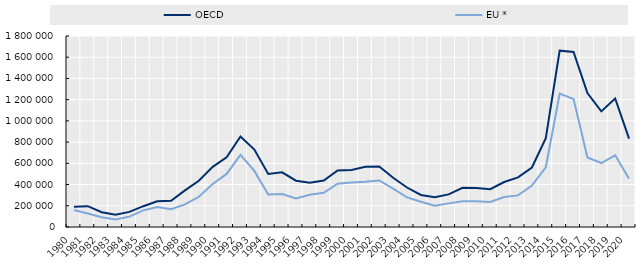
| Category | OECD | EU * |
|---|---|---|
| 1980.0 | 190529 | 159997 |
| 1981.0 | 196358 | 127564 |
| 1982.0 | 138679 | 91932 |
| 1983.0 | 115012 | 70282 |
| 1984.0 | 142302 | 97373 |
| 1985.0 | 196152 | 156711 |
| 1986.0 | 243156 | 188030 |
| 1987.0 | 246813 | 168459 |
| 1988.0 | 344604 | 213427 |
| 1989.0 | 435813 | 284890 |
| 1990.0 | 566814 | 405281 |
| 1991.0 | 657562 | 500255 |
| 1992.0 | 853314 | 679738 |
| 1993.0 | 730345 | 528805 |
| 1994.0 | 500175 | 306252 |
| 1995.0 | 514947 | 310960 |
| 1996.0 | 436244 | 269588 |
| 1997.0 | 416267 | 303512 |
| 1998.0 | 437215 | 322100 |
| 1999.0 | 531983 | 408577 |
| 2000.0 | 536974 | 420490 |
| 2001.0 | 566722 | 427344 |
| 2002.0 | 569874 | 438461 |
| 2003.0 | 464093 | 360874 |
| 2004.0 | 372116 | 279244 |
| 2005.0 | 302018 | 238107 |
| 2006.0 | 280712 | 201162 |
| 2007.0 | 307184 | 222715 |
| 2008.0 | 369071 | 242480 |
| 2009.0 | 367501 | 243230 |
| 2010.0 | 355964 | 236065 |
| 2011.0 | 424165 | 282210 |
| 2012.0 | 467599 | 297850 |
| 2013.0 | 560645 | 390345 |
| 2014.0 | 836484 | 562675 |
| 2015.0 | 1661490 | 1256610 |
| 2016.0 | 1649300 | 1206435 |
| 2017.0 | 1262300 | 654900 |
| 2018.0 | 1089800 | 602815 |
| 2019.0 | 1211166.277 | 675885 |
| 2020.0 | 832252.311 | 453647 |